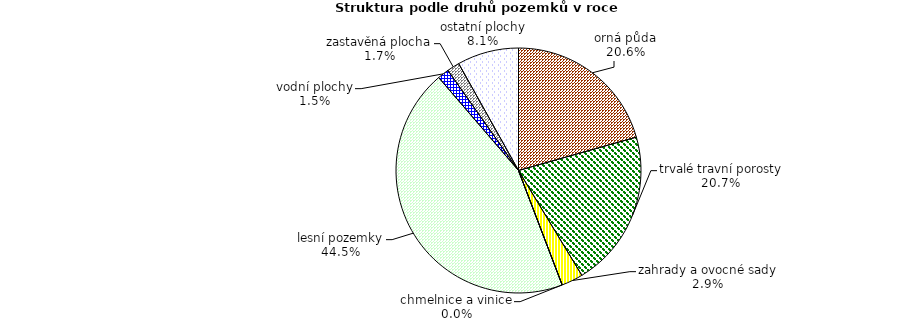
| Category | Struktura druhů pozemků |
|---|---|
| orná půda | 65189.933 |
| trvalé travní porosty | 65607.064 |
| zahrady a ovocné sady | 9001.485 |
| chmelnice a vinice | 27.264 |
| lesní pozemky | 140788.97 |
| vodní plochy | 4799.433 |
| zastavěná plocha | 5239.879 |
| ostatní plochy | 25687.821 |